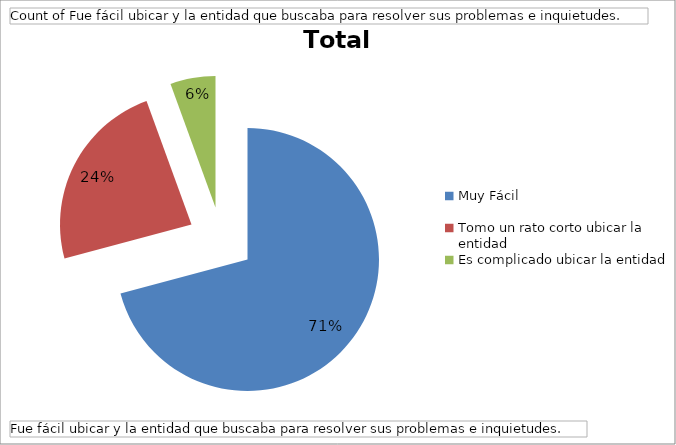
| Category | Total |
|---|---|
| Muy Fácil | 153 |
| Tomo un rato corto ubicar la entidad | 51 |
| Es complicado ubicar la entidad | 12 |